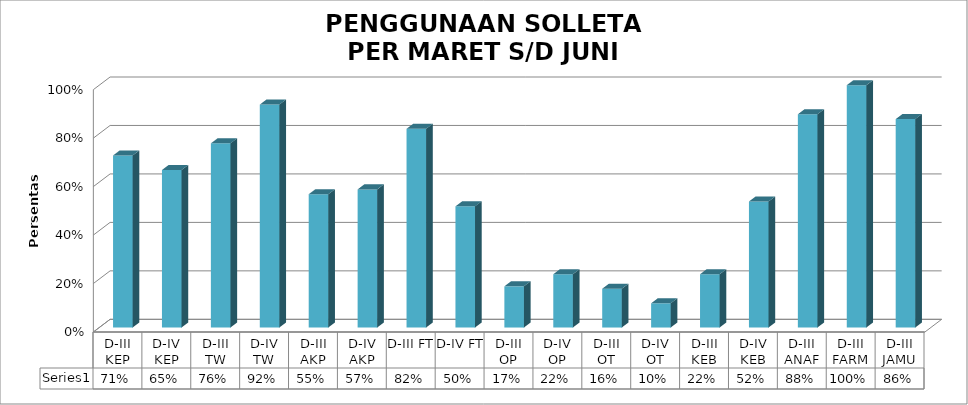
| Category | Series 0 |
|---|---|
| D-III KEP | 0.71 |
| D-IV KEP | 0.65 |
| D-III TW | 0.76 |
| D-IV TW | 0.92 |
| D-III AKP | 0.55 |
| D-IV AKP | 0.57 |
| D-III FT | 0.82 |
| D-IV FT | 0.5 |
| D-III OP | 0.17 |
| D-IV OP | 0.22 |
| D-III OT | 0.16 |
| D-IV OT | 0.1 |
| D-III KEB | 0.22 |
| D-IV KEB | 0.52 |
| D-III ANAF | 0.88 |
| D-III FARM | 1 |
| D-III JAMU | 0.86 |